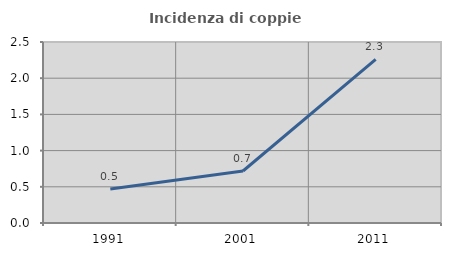
| Category | Incidenza di coppie miste |
|---|---|
| 1991.0 | 0.47 |
| 2001.0 | 0.718 |
| 2011.0 | 2.26 |